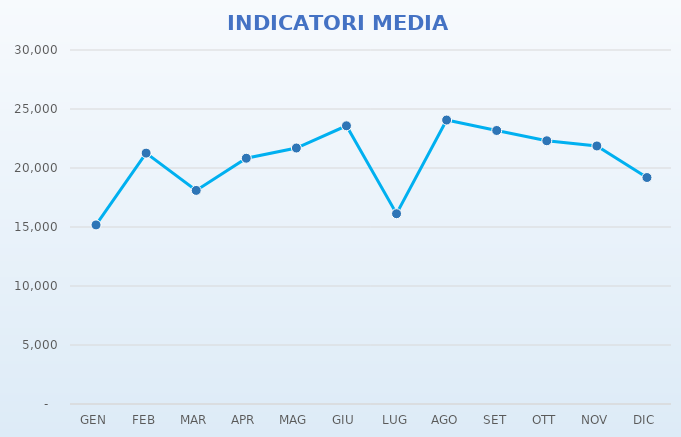
| Category | Series 0 | Series 1 |
|---|---|---|
| GEN |  | 15175 |
| FEB |  | 21262 |
| MAR |  | 18101 |
| APR |  | 20828 |
| MAG |  | 21694 |
| GIU |  | 23577 |
| LUG |  | 16125 |
| AGO |  | 24065 |
| SET |  | 23179 |
| OTT |  | 22307 |
| NOV |  | 21867 |
| DIC |  | 19193 |